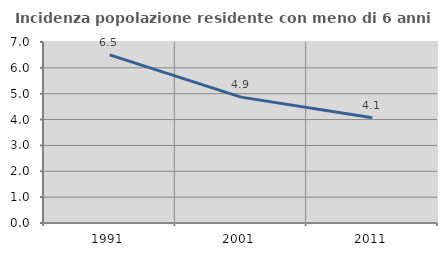
| Category | Incidenza popolazione residente con meno di 6 anni |
|---|---|
| 1991.0 | 6.502 |
| 2001.0 | 4.868 |
| 2011.0 | 4.069 |